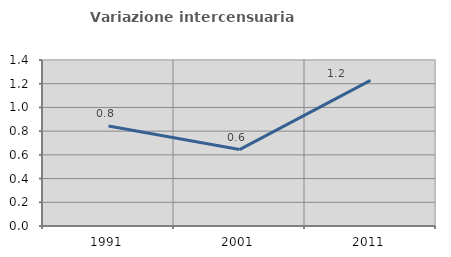
| Category | Variazione intercensuaria annua |
|---|---|
| 1991.0 | 0.843 |
| 2001.0 | 0.644 |
| 2011.0 | 1.229 |